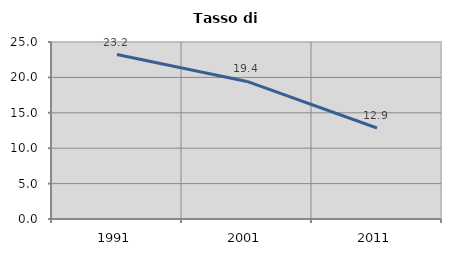
| Category | Tasso di disoccupazione   |
|---|---|
| 1991.0 | 23.226 |
| 2001.0 | 19.433 |
| 2011.0 | 12.857 |